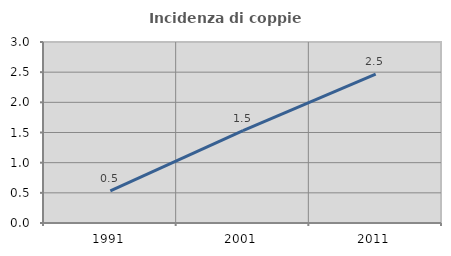
| Category | Incidenza di coppie miste |
|---|---|
| 1991.0 | 0.532 |
| 2001.0 | 1.532 |
| 2011.0 | 2.467 |